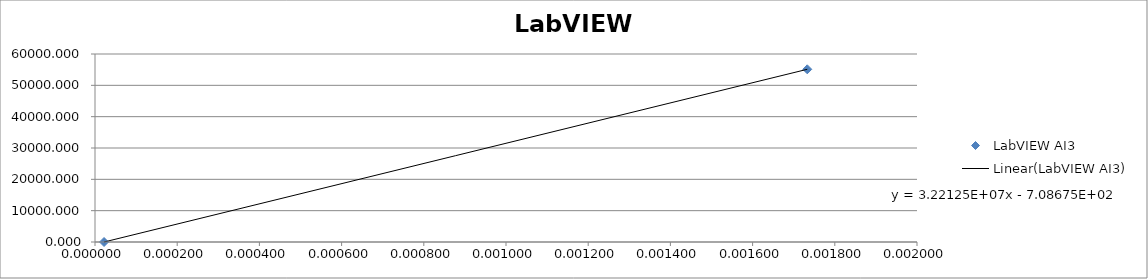
| Category | LabVIEW AI3 |
|---|---|
| 2.2e-05 | 0 |
| nan | 11023.113 |
| nan | 22046.226 |
| nan | 33069.339 |
| nan | 44092.452 |
| 0.001733 | 55115.566 |